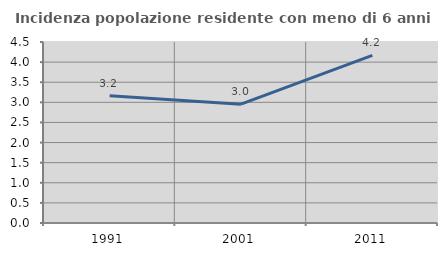
| Category | Incidenza popolazione residente con meno di 6 anni |
|---|---|
| 1991.0 | 3.161 |
| 2001.0 | 2.955 |
| 2011.0 | 4.167 |